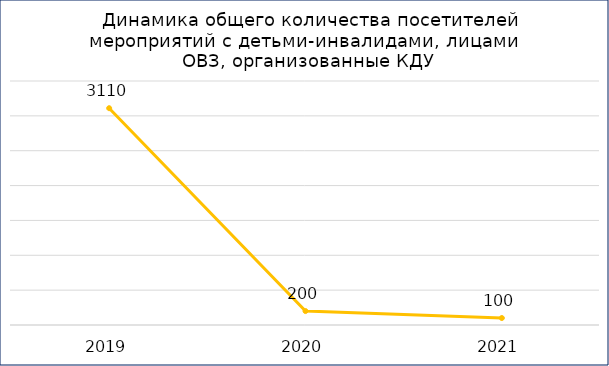
| Category | ИТОГО |
|---|---|
| 2019.0 | 3110 |
| 2020.0 | 200 |
| 2021.0 | 100 |